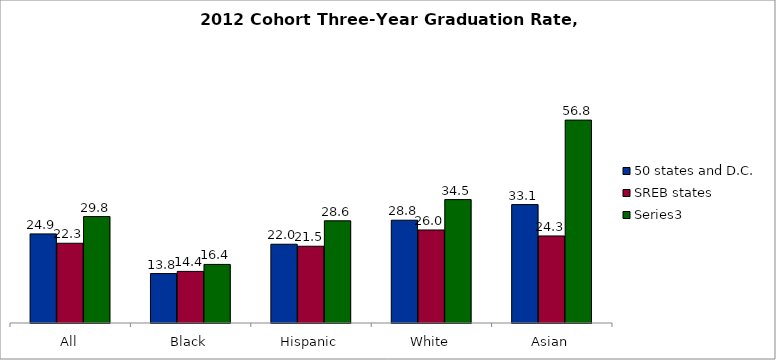
| Category | 50 states and D.C. | SREB states | Series 2 |
|---|---|---|---|
| All | 24.923 | 22.303 | 29.772 |
| Black | 13.831 | 14.432 | 16.388 |
| Hispanic | 22.03 | 21.47 | 28.587 |
| White | 28.754 | 26.019 | 34.522 |
| Asian | 33.118 | 24.347 | 56.757 |